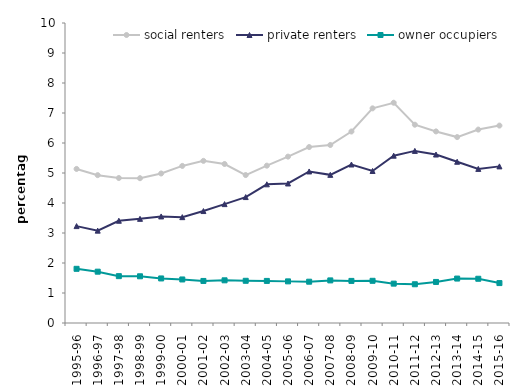
| Category | social renters | private renters | owner occupiers |
|---|---|---|---|
| 1995-96 | 5.135 | 3.23 | 1.806 |
| 1996-97 | 4.928 | 3.079 | 1.71 |
| 1997-98 | 4.833 | 3.408 | 1.562 |
| 1998-99 | 4.827 | 3.472 | 1.557 |
| 1999-00 | 4.984 | 3.552 | 1.485 |
| 2000-01 | 5.236 | 3.528 | 1.451 |
| 2001-02 | 5.404 | 3.732 | 1.402 |
| 2002-03 | 5.3 | 3.963 | 1.422 |
| 2003-04 | 4.932 | 4.197 | 1.407 |
| 2004-05 | 5.244 | 4.622 | 1.403 |
| 2005-06 | 5.546 | 4.651 | 1.388 |
| 2006-07 | 5.865 | 5.051 | 1.377 |
| 2007-08 | 5.934 | 4.938 | 1.42 |
| 2008-09 | 6.383 | 5.283 | 1.404 |
| 2009-10 | 7.155 | 5.068 | 1.406 |
| 2010-11 | 7.342 | 5.578 | 1.312 |
| 2011-12 | 6.61 | 5.737 | 1.292 |
| 2012-13 | 6.386 | 5.615 | 1.369 |
| 2013-14 | 6.197 | 5.375 | 1.481 |
| 2014-15 | 6.447 | 5.136 | 1.475 |
| 2015-16 | 6.58 | 5.221 | 1.331 |